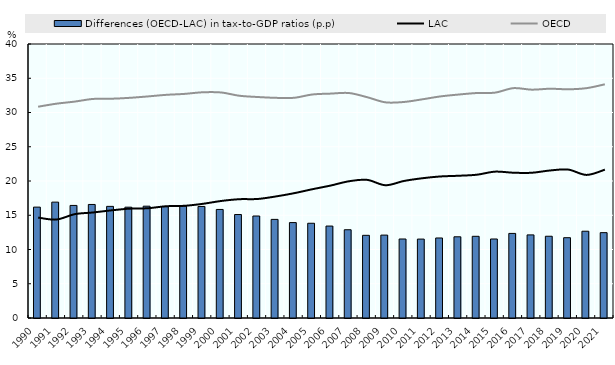
| Category | Differences (OECD-LAC) in tax-to-GDP ratios (p.p) |
|---|---|
| 1990.0 | 16.188 |
| 1991.0 | 16.915 |
| 1992.0 | 16.434 |
| 1993.0 | 16.574 |
| 1994.0 | 16.297 |
| 1995.0 | 16.179 |
| 1996.0 | 16.324 |
| 1997.0 | 16.261 |
| 1998.0 | 16.339 |
| 1999.0 | 16.285 |
| 2000.0 | 15.847 |
| 2001.0 | 15.106 |
| 2002.0 | 14.889 |
| 2003.0 | 14.397 |
| 2004.0 | 13.928 |
| 2005.0 | 13.83 |
| 2006.0 | 13.422 |
| 2007.0 | 12.884 |
| 2008.0 | 12.069 |
| 2009.0 | 12.102 |
| 2010.0 | 11.535 |
| 2011.0 | 11.52 |
| 2012.0 | 11.683 |
| 2013.0 | 11.855 |
| 2014.0 | 11.926 |
| 2015.0 | 11.535 |
| 2016.0 | 12.348 |
| 2017.0 | 12.132 |
| 2018.0 | 11.935 |
| 2019.0 | 11.723 |
| 2020.0 | 12.668 |
| 2021.0 | 12.461 |